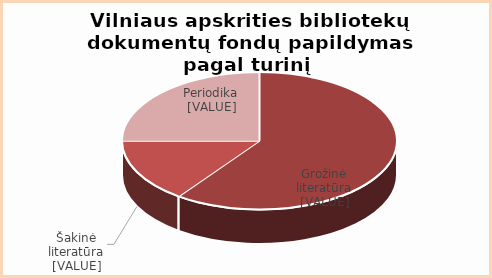
| Category | Series 0 |
|---|---|
| grožinė | 0.6 |
| šakinė  | 0.15 |
| periodika | 0.25 |